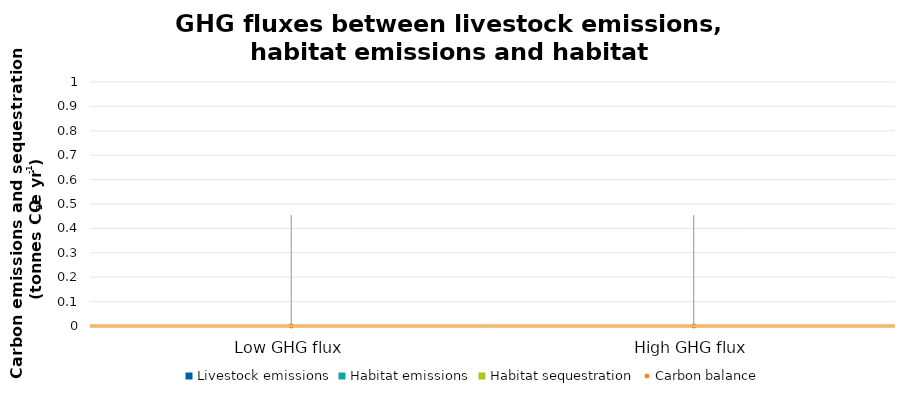
| Category | Livestock emissions | Habitat emissions | Habitat sequestration |
|---|---|---|---|
| Low GHG flux | 0 | 0 | 0 |
| High GHG flux | 0 | 0 | 0 |